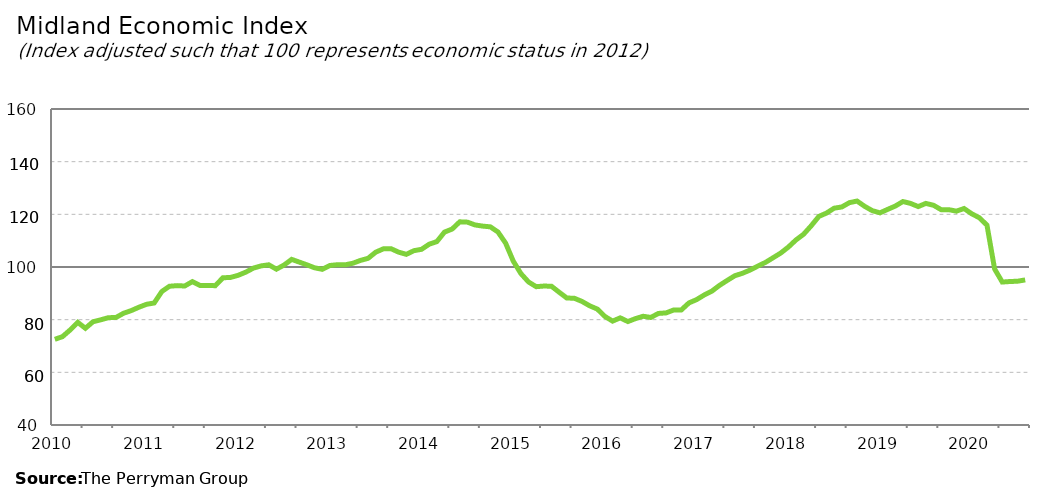
| Category | Midland Composite |
|---|---|
| 2010-01-31 | 72.54 |
| 2010-02-28 | 73.553 |
| 2010-03-31 | 76.079 |
| 2010-04-30 | 78.984 |
| 2010-05-31 | 76.734 |
| 2010-06-30 | 79.208 |
| 2010-07-31 | 79.934 |
| 2010-08-31 | 80.749 |
| 2010-09-30 | 80.829 |
| 2010-10-31 | 82.437 |
| 2010-11-30 | 83.44 |
| 2010-12-31 | 84.72 |
| 2011-01-31 | 85.83 |
| 2011-02-28 | 86.332 |
| 2011-03-31 | 90.682 |
| 2011-04-30 | 92.683 |
| 2011-05-31 | 92.929 |
| 2011-06-30 | 92.78 |
| 2011-07-31 | 94.443 |
| 2011-08-31 | 93.003 |
| 2011-09-30 | 93.01 |
| 2011-10-31 | 92.903 |
| 2011-11-30 | 95.905 |
| 2011-12-31 | 96.043 |
| 2012-01-31 | 96.846 |
| 2012-02-29 | 98.055 |
| 2012-03-31 | 99.589 |
| 2012-04-30 | 100.42 |
| 2012-05-31 | 100.834 |
| 2012-06-30 | 99.173 |
| 2012-07-31 | 100.74 |
| 2012-08-31 | 102.895 |
| 2012-09-30 | 101.854 |
| 2012-10-31 | 100.82 |
| 2012-11-30 | 99.689 |
| 2012-12-31 | 99.124 |
| 2013-01-31 | 100.575 |
| 2013-02-28 | 100.87 |
| 2013-03-31 | 100.823 |
| 2013-04-30 | 101.422 |
| 2013-05-31 | 102.496 |
| 2013-06-30 | 103.298 |
| 2013-07-31 | 105.627 |
| 2013-08-31 | 106.894 |
| 2013-09-30 | 106.947 |
| 2013-10-31 | 105.636 |
| 2013-11-30 | 104.806 |
| 2013-12-31 | 106.195 |
| 2014-01-31 | 106.721 |
| 2014-02-28 | 108.664 |
| 2014-03-31 | 109.65 |
| 2014-04-30 | 113.255 |
| 2014-05-31 | 114.405 |
| 2014-06-30 | 117.159 |
| 2014-07-31 | 117.034 |
| 2014-08-31 | 115.968 |
| 2014-09-30 | 115.528 |
| 2014-10-31 | 115.252 |
| 2014-11-30 | 113.299 |
| 2014-12-31 | 109.052 |
| 2015-01-31 | 102.244 |
| 2015-02-28 | 97.501 |
| 2015-03-31 | 94.311 |
| 2015-04-30 | 92.526 |
| 2015-05-31 | 92.762 |
| 2015-06-30 | 92.701 |
| 2015-07-31 | 90.438 |
| 2015-08-31 | 88.235 |
| 2015-09-30 | 88.114 |
| 2015-10-31 | 86.918 |
| 2015-11-30 | 85.262 |
| 2015-12-31 | 84.021 |
| 2016-01-31 | 81.216 |
| 2016-02-29 | 79.453 |
| 2016-03-31 | 80.687 |
| 2016-04-30 | 79.284 |
| 2016-05-31 | 80.402 |
| 2016-06-30 | 81.291 |
| 2016-07-31 | 80.84 |
| 2016-08-31 | 82.365 |
| 2016-09-30 | 82.564 |
| 2016-10-31 | 83.68 |
| 2016-11-30 | 83.711 |
| 2016-12-31 | 86.375 |
| 2017-01-31 | 87.623 |
| 2017-02-28 | 89.384 |
| 2017-03-31 | 90.847 |
| 2017-04-30 | 93.03 |
| 2017-05-31 | 94.896 |
| 2017-06-30 | 96.683 |
| 2017-07-31 | 97.619 |
| 2017-08-31 | 98.845 |
| 2017-09-30 | 100.332 |
| 2017-10-31 | 101.729 |
| 2017-11-30 | 103.502 |
| 2017-12-31 | 105.285 |
| 2018-01-31 | 107.559 |
| 2018-02-28 | 110.269 |
| 2018-03-31 | 112.437 |
| 2018-04-30 | 115.669 |
| 2018-05-31 | 119.216 |
| 2018-06-30 | 120.483 |
| 2018-07-31 | 122.333 |
| 2018-08-31 | 122.799 |
| 2018-09-30 | 124.441 |
| 2018-10-31 | 125.041 |
| 2018-11-30 | 123.019 |
| 2018-12-31 | 121.382 |
| 2019-01-31 | 120.568 |
| 2019-02-28 | 121.88 |
| 2019-03-31 | 123.136 |
| 2019-04-30 | 124.862 |
| 2019-05-31 | 124.138 |
| 2019-06-30 | 122.946 |
| 2019-07-31 | 124.153 |
| 2019-08-31 | 123.444 |
| 2019-09-30 | 121.776 |
| 2019-10-31 | 121.773 |
| 2019-11-30 | 121.207 |
| 2019-12-31 | 122.207 |
| 2020-01-31 | 120.215 |
| 2020-02-29 | 118.702 |
| 2020-03-31 | 115.889 |
| 2020-04-30 | 99.25 |
| 2020-05-31 | 94.284 |
| 2020-06-30 | 94.486 |
| 2020-07-31 | 94.597 |
| 2020-08-31 | 95.092 |